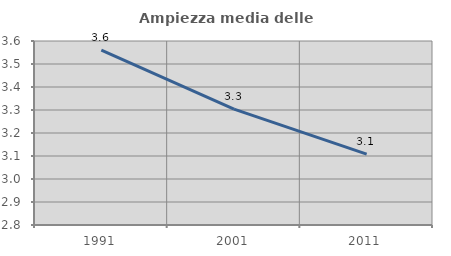
| Category | Ampiezza media delle famiglie |
|---|---|
| 1991.0 | 3.561 |
| 2001.0 | 3.304 |
| 2011.0 | 3.108 |